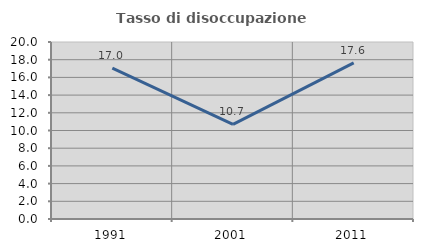
| Category | Tasso di disoccupazione giovanile  |
|---|---|
| 1991.0 | 17.037 |
| 2001.0 | 10.684 |
| 2011.0 | 17.647 |